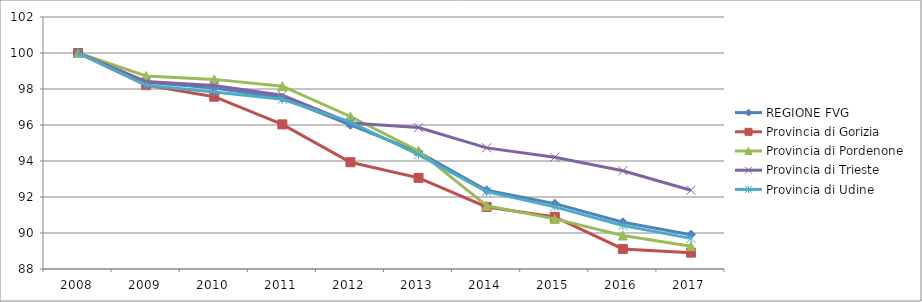
| Category | REGIONE FVG | Provincia di Gorizia  | Provincia di Pordenone | Provincia di Trieste | Provincia di Udine |
|---|---|---|---|---|---|
| 2008.0 | 100 | 100 | 100 | 100 | 100 |
| 2009.0 | 98.378 | 98.214 | 98.723 | 98.416 | 98.213 |
| 2010.0 | 98.049 | 97.573 | 98.535 | 98.197 | 97.839 |
| 2011.0 | 97.515 | 96.033 | 98.157 | 97.653 | 97.431 |
| 2012.0 | 96.012 | 93.931 | 96.472 | 96.115 | 96.162 |
| 2013.0 | 94.5 | 93.063 | 94.558 | 95.857 | 94.348 |
| 2014.0 | 92.37 | 91.445 | 91.517 | 94.73 | 92.296 |
| 2015.0 | 91.632 | 90.892 | 90.784 | 94.206 | 91.451 |
| 2016.0 | 90.595 | 89.116 | 89.863 | 93.457 | 90.414 |
| 2017.0 | 89.908 | 88.909 | 89.262 | 92.376 | 89.702 |